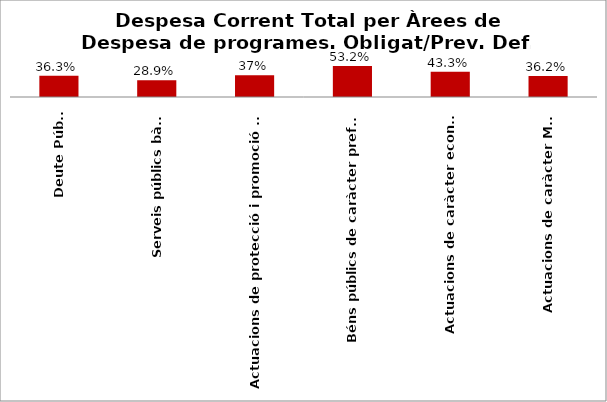
| Category | Series 0 |
|---|---|
| Deute Públic | 0.363 |
| Serveis públics bàsics | 0.289 |
| Actuacions de protecció i promoció social | 0.374 |
| Béns públics de caràcter preferent | 0.532 |
| Actuacions de caràcter econòmic | 0.433 |
| Actuacions de caràcter Marçal | 0.362 |